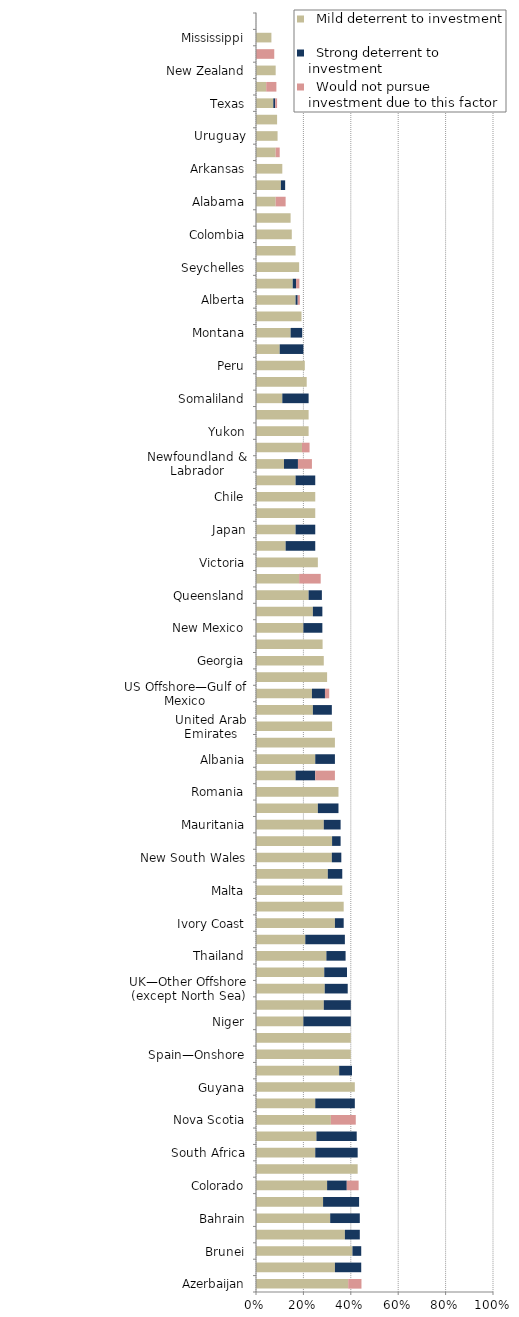
| Category |   Mild deterrent to investment |   Strong deterrent to investment |   Would not pursue investment due to this factor |
|---|---|---|---|
| Azerbaijan | 0.389 | 0 | 0.056 |
| Norway—Other Offshore (except North Sea) | 0.333 | 0.111 | 0 |
| Brunei | 0.407 | 0.037 | 0 |
| Poland | 0.375 | 0.063 | 0 |
| Bahrain | 0.313 | 0.125 | 0 |
| Gabon | 0.283 | 0.152 | 0 |
| Colorado | 0.3 | 0.083 | 0.05 |
| West Virginia | 0.429 | 0 | 0 |
| South Africa | 0.25 | 0.179 | 0 |
| Norway—North Sea | 0.255 | 0.17 | 0 |
| Nova Scotia | 0.316 | 0 | 0.105 |
| Illinois | 0.25 | 0.167 | 0 |
| Guyana | 0.417 | 0 | 0 |
| Ghana | 0.351 | 0.054 | 0 |
| Spain—Onshore | 0.4 | 0 | 0 |
| Kyrgyzstan | 0.4 | 0 | 0 |
| Niger | 0.2 | 0.2 | 0 |
| Papua New Guinea | 0.286 | 0.114 | 0 |
| UK—Other Offshore (except North Sea) | 0.29 | 0.097 | 0 |
| Western Australia | 0.288 | 0.096 | 0 |
| Thailand | 0.297 | 0.081 | 0 |
| Brazil—Onshore CC | 0.208 | 0.167 | 0 |
| Ivory Coast | 0.333 | 0.037 | 0 |
| Qatar | 0.37 | 0 | 0 |
| Malta | 0.364 | 0 | 0 |
| Netherlands—Offshore | 0.303 | 0.061 | 0 |
| New South Wales | 0.32 | 0.04 | 0 |
| Michigan | 0.321 | 0.036 | 0 |
| Mauritania | 0.286 | 0.071 | 0 |
| Ireland | 0.261 | 0.087 | 0 |
| Romania | 0.348 | 0 | 0 |
| New Brunswick | 0.167 | 0.083 | 0.083 |
| Albania | 0.25 | 0.083 | 0 |
| Trinidad and Tobago | 0.333 | 0 | 0 |
| United Arab Emirates | 0.321 | 0 | 0 |
| Northern Territory | 0.24 | 0.08 | 0 |
| US Offshore—Gulf of Mexico | 0.236 | 0.055 | 0.018 |
| Jordan | 0.3 | 0 | 0 |
| Georgia | 0.286 | 0 | 0 |
| Philippines | 0.281 | 0 | 0 |
| New Mexico | 0.2 | 0.08 | 0 |
| Namibia | 0.24 | 0.04 | 0 |
| Queensland | 0.222 | 0.056 | 0 |
| Northwest Territories | 0.182 | 0 | 0.091 |
| Victoria | 0.261 | 0 | 0 |
| Greenland | 0.125 | 0.125 | 0 |
| Japan | 0.167 | 0.083 | 0 |
| Morocco | 0.25 | 0 | 0 |
| Chile | 0.25 | 0 | 0 |
| Suriname | 0.167 | 0.083 | 0 |
| Newfoundland & Labrador | 0.118 | 0.059 | 0.059 |
| Utah | 0.194 | 0 | 0.032 |
| Yukon | 0.222 | 0 | 0 |
| Ethiopia | 0.222 | 0 | 0 |
| Somaliland | 0.111 | 0.111 | 0 |
| Ohio | 0.214 | 0 | 0 |
| Peru | 0.206 | 0 | 0 |
| Cyprus | 0.1 | 0.1 | 0 |
| Montana | 0.146 | 0.049 | 0 |
| South Australia | 0.192 | 0 | 0 |
| Alberta | 0.167 | 0.009 | 0.009 |
| Louisiana | 0.155 | 0.014 | 0.014 |
| Seychelles | 0.182 | 0 | 0 |
| French Guiana | 0.167 | 0 | 0 |
| Colombia | 0.151 | 0 | 0 |
| Kansas | 0.146 | 0 | 0 |
| Alabama | 0.083 | 0 | 0.042 |
| Wyoming | 0.105 | 0.018 | 0 |
| Arkansas | 0.111 | 0 | 0 |
| Oklahoma | 0.083 | 0 | 0.017 |
| Uruguay | 0.091 | 0 | 0 |
| North Dakota | 0.089 | 0 | 0 |
| Texas | 0.073 | 0.008 | 0.008 |
| Saskatchewan | 0.043 | 0 | 0.043 |
| New Zealand | 0.083 | 0 | 0 |
| Manitoba | 0 | 0 | 0.077 |
| Mississippi | 0.065 | 0 | 0 |
| Tasmania | 0 | 0 | 0 |